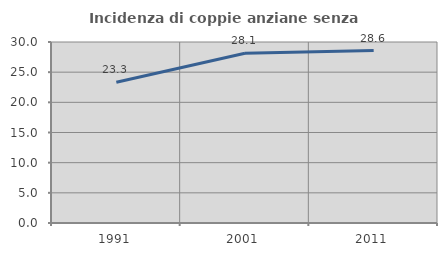
| Category | Incidenza di coppie anziane senza figli  |
|---|---|
| 1991.0 | 23.333 |
| 2001.0 | 28.125 |
| 2011.0 | 28.571 |